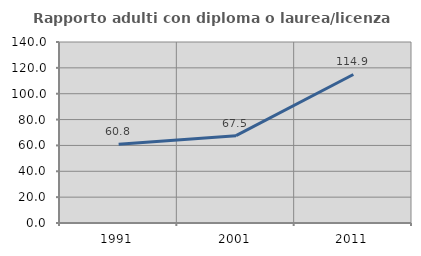
| Category | Rapporto adulti con diploma o laurea/licenza media  |
|---|---|
| 1991.0 | 60.837 |
| 2001.0 | 67.536 |
| 2011.0 | 114.887 |